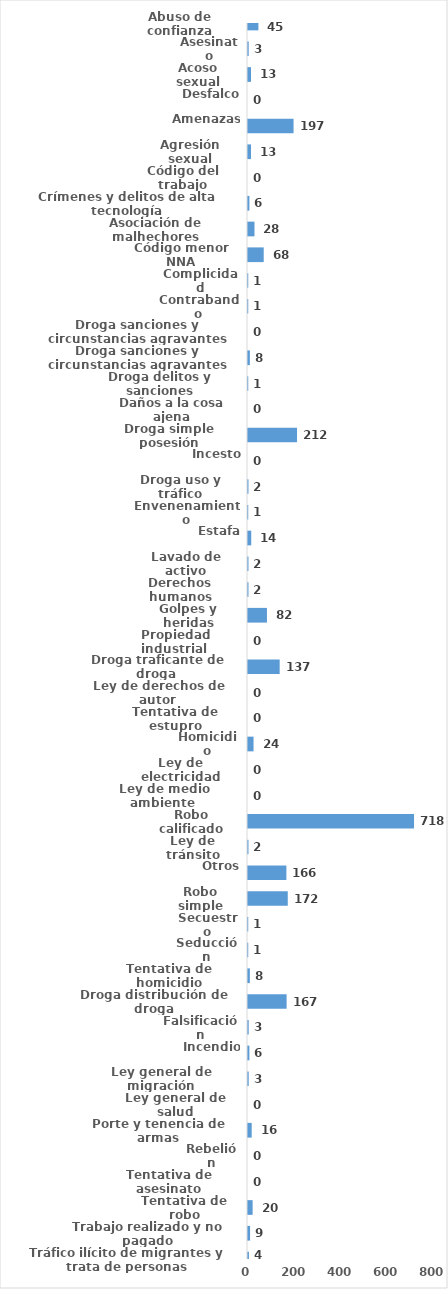
| Category | Series 0 |
|---|---|
| Abuso de confianza | 45 |
| Asesinato | 3 |
| Acoso sexual | 13 |
| Desfalco | 0 |
| Amenazas | 197 |
| Agresión sexual | 13 |
| Código del trabajo | 0 |
| Crímenes y delitos de alta tecnología | 6 |
| Asociación de malhechores | 28 |
| Código menor NNA | 68 |
| Complicidad | 1 |
| Contrabando | 1 |
| Droga sanciones y circunstancias agravantes | 0 |
| Droga sanciones y circunstancias agravantes | 8 |
| Droga delitos y sanciones | 1 |
| Daños a la cosa ajena | 0 |
| Droga simple posesión | 212 |
| Incesto | 0 |
| Droga uso y tráfico | 2 |
| Envenenamiento | 1 |
| Estafa | 14 |
| Lavado de activo | 2 |
| Derechos humanos | 2 |
| Golpes y heridas | 82 |
| Propiedad industrial  | 0 |
| Droga traficante de droga  | 137 |
| Ley de derechos de autor  | 0 |
| Tentativa de estupro | 0 |
| Homicidio | 24 |
| Ley de electricidad | 0 |
| Ley de medio ambiente  | 0 |
| Robo calificado | 718 |
| Ley de tránsito | 2 |
| Otros | 166 |
| Robo simple | 172 |
| Secuestro | 1 |
| Seducción | 1 |
| Tentativa de homicidio | 8 |
| Droga distribución de droga | 167 |
| Falsificación | 3 |
| Incendio | 6 |
| Ley general de migración | 3 |
| Ley general de salud | 0 |
| Porte y tenencia de armas | 16 |
| Rebelión | 0 |
| Tentativa de asesinato | 0 |
| Tentativa de robo | 20 |
| Trabajo realizado y no pagado | 9 |
| Tráfico ilícito de migrantes y trata de personas | 4 |